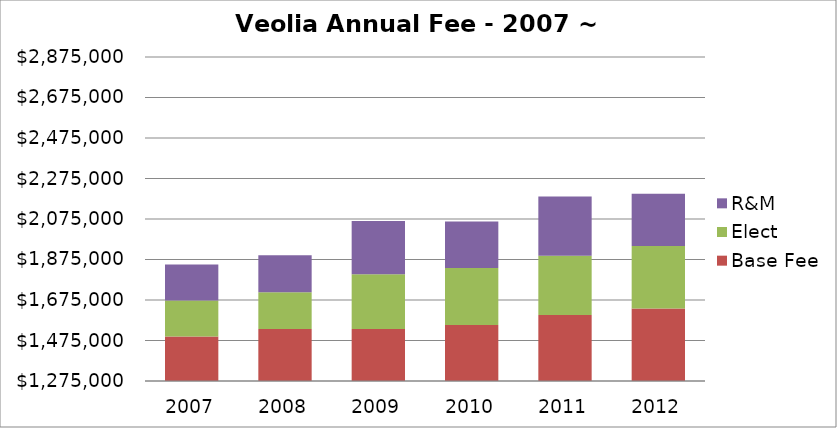
| Category | Base Fee | Elect | R&M |
|---|---|---|---|
| 2007.0 | 1494800 | 177600 | 177600 |
| 2008.0 | 1531694 | 181985 | 181985 |
| 2009.0 | 1531694 | 270902.76 | 263036.24 |
| 2010.0 | 1551816.83 | 280747.13 | 230255.05 |
| 2011.0 | 1601385.01 | 291613.88 | 292879.72 |
| 2012.0 | 1632634.92 | 308684 | 258575 |